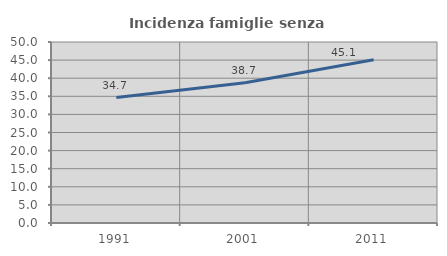
| Category | Incidenza famiglie senza nuclei |
|---|---|
| 1991.0 | 34.667 |
| 2001.0 | 38.741 |
| 2011.0 | 45.08 |